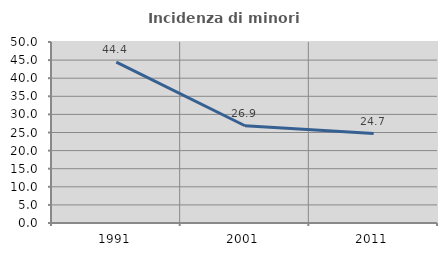
| Category | Incidenza di minori stranieri |
|---|---|
| 1991.0 | 44.444 |
| 2001.0 | 26.866 |
| 2011.0 | 24.719 |